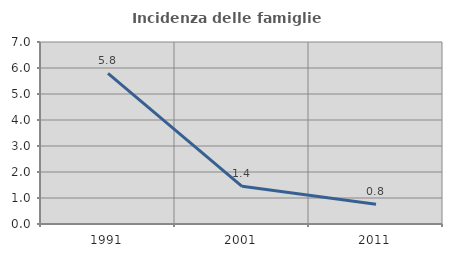
| Category | Incidenza delle famiglie numerose |
|---|---|
| 1991.0 | 5.797 |
| 2001.0 | 1.449 |
| 2011.0 | 0.758 |